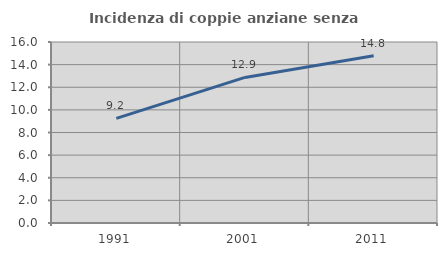
| Category | Incidenza di coppie anziane senza figli  |
|---|---|
| 1991.0 | 9.246 |
| 2001.0 | 12.869 |
| 2011.0 | 14.792 |